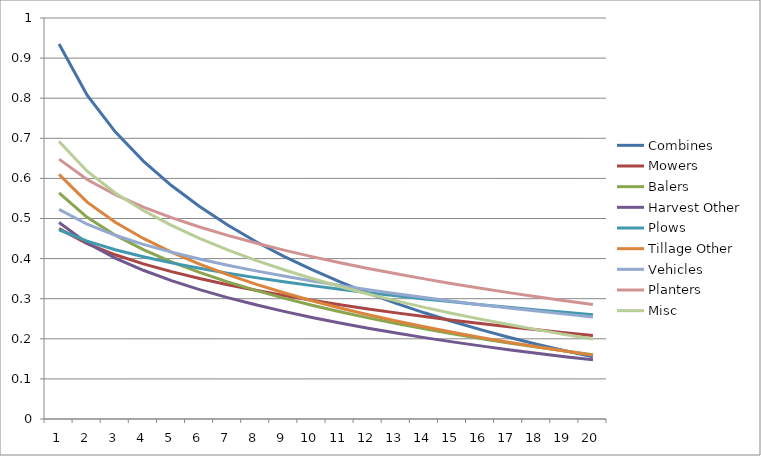
| Category | Combines | Mowers | Balers | Harvest Other | Plows | Tillage Other | Vehicles | Planters | Misc |
|---|---|---|---|---|---|---|---|---|---|
| 0 | 0.935 | 0.475 | 0.564 | 0.49 | 0.472 | 0.61 | 0.523 | 0.648 | 0.692 |
| 1 | 0.808 | 0.437 | 0.503 | 0.439 | 0.443 | 0.541 | 0.486 | 0.597 | 0.618 |
| 2 | 0.716 | 0.41 | 0.458 | 0.401 | 0.422 | 0.491 | 0.458 | 0.559 | 0.564 |
| 3 | 0.643 | 0.387 | 0.422 | 0.371 | 0.404 | 0.45 | 0.436 | 0.529 | 0.52 |
| 4 | 0.582 | 0.367 | 0.392 | 0.345 | 0.389 | 0.416 | 0.416 | 0.502 | 0.483 |
| 5 | 0.53 | 0.35 | 0.366 | 0.323 | 0.376 | 0.386 | 0.399 | 0.479 | 0.45 |
| 6 | 0.484 | 0.335 | 0.342 | 0.303 | 0.364 | 0.36 | 0.384 | 0.458 | 0.422 |
| 7 | 0.443 | 0.321 | 0.321 | 0.285 | 0.353 | 0.336 | 0.369 | 0.439 | 0.396 |
| 8 | 0.406 | 0.308 | 0.301 | 0.268 | 0.342 | 0.315 | 0.356 | 0.421 | 0.372 |
| 9 | 0.372 | 0.296 | 0.284 | 0.253 | 0.333 | 0.295 | 0.344 | 0.405 | 0.35 |
| 10 | 0.342 | 0.285 | 0.267 | 0.239 | 0.324 | 0.277 | 0.333 | 0.39 | 0.33 |
| 11 | 0.314 | 0.274 | 0.252 | 0.226 | 0.315 | 0.26 | 0.322 | 0.376 | 0.312 |
| 12 | 0.288 | 0.265 | 0.238 | 0.214 | 0.307 | 0.244 | 0.312 | 0.362 | 0.295 |
| 13 | 0.265 | 0.255 | 0.225 | 0.203 | 0.299 | 0.23 | 0.303 | 0.349 | 0.278 |
| 14 | 0.243 | 0.247 | 0.212 | 0.192 | 0.292 | 0.216 | 0.294 | 0.337 | 0.263 |
| 15 | 0.223 | 0.238 | 0.201 | 0.182 | 0.285 | 0.203 | 0.285 | 0.326 | 0.249 |
| 16 | 0.204 | 0.23 | 0.19 | 0.173 | 0.278 | 0.191 | 0.277 | 0.315 | 0.236 |
| 17 | 0.187 | 0.223 | 0.179 | 0.164 | 0.272 | 0.18 | 0.269 | 0.305 | 0.223 |
| 18 | 0.17 | 0.215 | 0.17 | 0.156 | 0.266 | 0.169 | 0.262 | 0.295 | 0.211 |
| 19 | 0.155 | 0.208 | 0.16 | 0.147 | 0.26 | 0.159 | 0.254 | 0.285 | 0.199 |